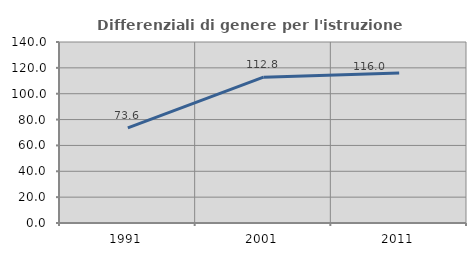
| Category | Differenziali di genere per l'istruzione superiore |
|---|---|
| 1991.0 | 73.63 |
| 2001.0 | 112.824 |
| 2011.0 | 115.981 |